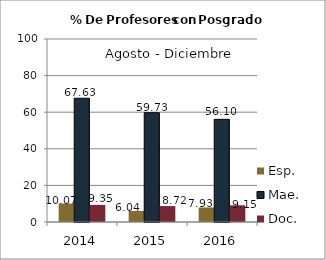
| Category | Esp. | Mae. | Doc. |
|---|---|---|---|
| 2014.0 | 10.07 | 67.63 | 9.35 |
| 2015.0 | 6.04 | 59.73 | 8.72 |
| 2016.0 | 7.93 | 56.1 | 9.15 |